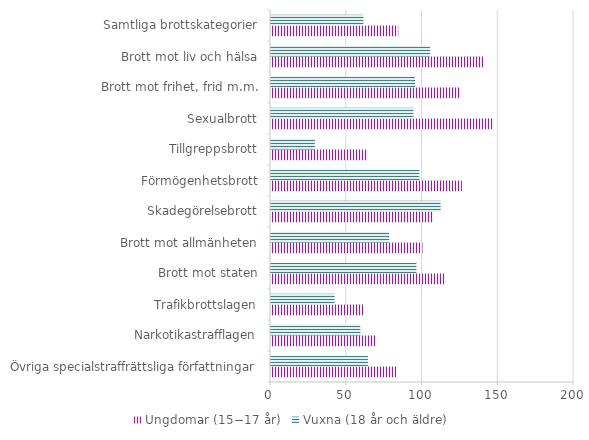
| Category | Ungdomar (15−17 år)  | Vuxna (18 år och äldre)  |
|---|---|---|
| Övriga specialstraffrättsliga författningar | 83 | 64 |
| Narkotikastrafflagen | 69 | 59 |
| Trafikbrottslagen | 61 | 42 |
| Brott mot staten | 115 | 96 |
| Brott mot allmänheten | 100 | 78 |
| Skadegörelsebrott | 107 | 112 |
| Förmögenhetsbrott | 126 | 98 |
| Tillgreppsbrott | 64 | 29 |
| Sexualbrott | 147 | 94 |
| Brott mot frihet, frid m.m. | 125 | 95 |
| Brott mot liv och hälsa | 140 | 105 |
| Samtliga brottskategorier | 84 | 61 |